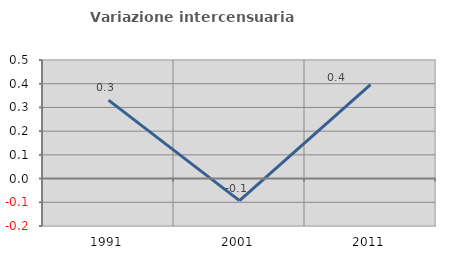
| Category | Variazione intercensuaria annua |
|---|---|
| 1991.0 | 0.331 |
| 2001.0 | -0.093 |
| 2011.0 | 0.396 |